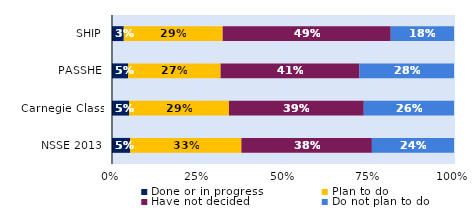
| Category | Done or in progress | Plan to do | Have not decided | Do not plan to do |
|---|---|---|---|---|
| SHIP | 0.034 | 0.289 | 0.491 | 0.185 |
| PASSHE | 0.047 | 0.271 | 0.406 | 0.276 |
| Carnegie Class | 0.05 | 0.292 | 0.394 | 0.264 |
| NSSE 2013 | 0.053 | 0.325 | 0.382 | 0.24 |